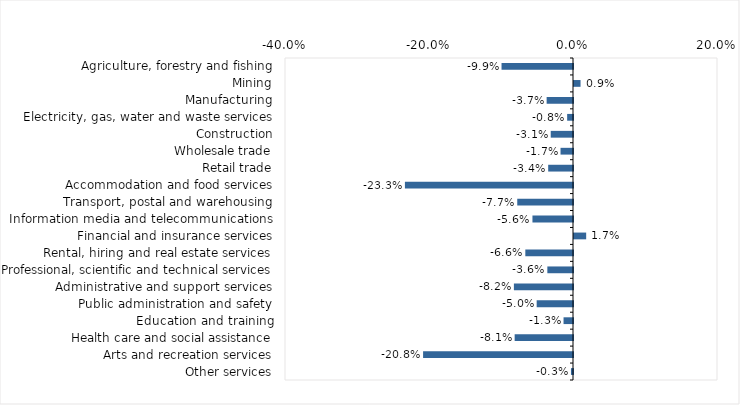
| Category | This week |
|---|---|
| Agriculture, forestry and fishing | -0.099 |
| Mining | 0.009 |
| Manufacturing | -0.037 |
| Electricity, gas, water and waste services | -0.008 |
| Construction | -0.031 |
| Wholesale trade | -0.017 |
| Retail trade | -0.034 |
| Accommodation and food services | -0.233 |
| Transport, postal and warehousing | -0.077 |
| Information media and telecommunications | -0.056 |
| Financial and insurance services | 0.017 |
| Rental, hiring and real estate services | -0.066 |
| Professional, scientific and technical services | -0.036 |
| Administrative and support services | -0.082 |
| Public administration and safety | -0.05 |
| Education and training | -0.013 |
| Health care and social assistance | -0.081 |
| Arts and recreation services | -0.208 |
| Other services | -0.003 |